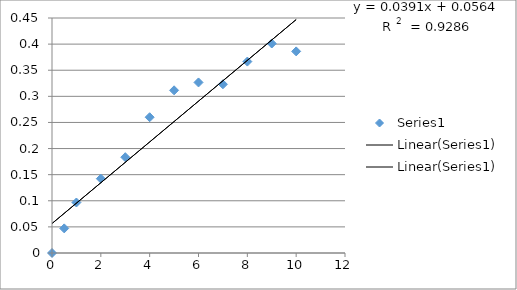
| Category | Series 0 |
|---|---|
| 0.0 | 0 |
| 0.5 | 0.047 |
| 1.0 | 0.097 |
| 2.0 | 0.142 |
| 3.0 | 0.183 |
| 4.0 | 0.26 |
| 5.0 | 0.311 |
| 6.0 | 0.327 |
| 7.0 | 0.323 |
| 8.0 | 0.367 |
| 9.0 | 0.401 |
| 10.0 | 0.386 |